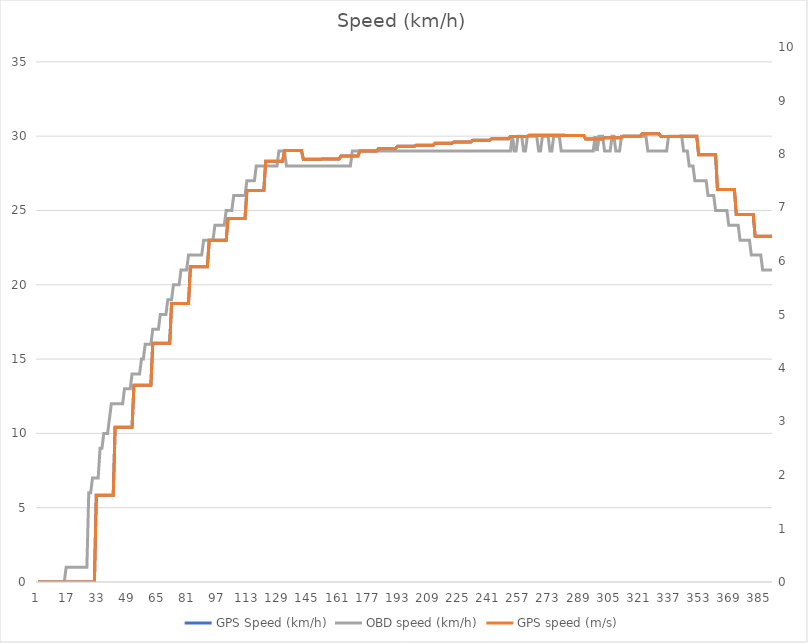
| Category | GPS Speed (km/h) | OBD speed (km/h) |
|---|---|---|
| 0 | 0 | 0 |
| 1 | 0 | 0 |
| 2 | 0 | 0 |
| 3 | 0 | 0 |
| 4 | 0 | 0 |
| 5 | 0 | 0 |
| 6 | 0 | 0 |
| 7 | 0 | 0 |
| 8 | 0 | 0 |
| 9 | 0 | 0 |
| 10 | 0 | 0 |
| 11 | 0 | 0 |
| 12 | 0 | 0 |
| 13 | 0 | 0 |
| 14 | 0 | 0 |
| 15 | 0 | 1 |
| 16 | 0 | 1 |
| 17 | 0 | 1 |
| 18 | 0 | 1 |
| 19 | 0 | 1 |
| 20 | 0 | 1 |
| 21 | 0 | 1 |
| 22 | 0 | 1 |
| 23 | 0 | 1 |
| 24 | 0 | 1 |
| 25 | 0 | 1 |
| 26 | 0 | 1 |
| 27 | 0 | 6 |
| 28 | 0 | 6 |
| 29 | 0 | 7 |
| 30 | 0 | 7 |
| 31 | 5.837 | 7 |
| 32 | 5.837 | 7 |
| 33 | 5.837 | 9 |
| 34 | 5.837 | 9 |
| 35 | 5.837 | 10 |
| 36 | 5.837 | 10 |
| 37 | 5.837 | 10 |
| 38 | 5.837 | 11 |
| 39 | 5.837 | 12 |
| 40 | 5.837 | 12 |
| 41 | 10.408 | 12 |
| 42 | 10.408 | 12 |
| 43 | 10.408 | 12 |
| 44 | 10.408 | 12 |
| 45 | 10.408 | 12 |
| 46 | 10.408 | 13 |
| 47 | 10.408 | 13 |
| 48 | 10.408 | 13 |
| 49 | 10.408 | 13 |
| 50 | 10.408 | 14 |
| 51 | 13.245 | 14 |
| 52 | 13.245 | 14 |
| 53 | 13.245 | 14 |
| 54 | 13.245 | 14 |
| 55 | 13.245 | 15 |
| 56 | 13.245 | 15 |
| 57 | 13.245 | 16 |
| 58 | 13.245 | 16 |
| 59 | 13.245 | 16 |
| 60 | 13.245 | 16 |
| 61 | 16.068 | 17 |
| 62 | 16.068 | 17 |
| 63 | 16.068 | 17 |
| 64 | 16.068 | 17 |
| 65 | 16.068 | 18 |
| 66 | 16.068 | 18 |
| 67 | 16.068 | 18 |
| 68 | 16.068 | 18 |
| 69 | 16.068 | 19 |
| 70 | 16.068 | 19 |
| 71 | 18.743 | 19 |
| 72 | 18.743 | 20 |
| 73 | 18.743 | 20 |
| 74 | 18.743 | 20 |
| 75 | 18.743 | 20 |
| 76 | 18.743 | 21 |
| 77 | 18.743 | 21 |
| 78 | 18.743 | 21 |
| 79 | 18.743 | 21 |
| 80 | 18.743 | 22 |
| 81 | 21.209 | 22 |
| 82 | 21.209 | 22 |
| 83 | 21.209 | 22 |
| 84 | 21.209 | 22 |
| 85 | 21.209 | 22 |
| 86 | 21.209 | 22 |
| 87 | 21.209 | 22 |
| 88 | 21.209 | 23 |
| 89 | 21.209 | 23 |
| 90 | 21.209 | 23 |
| 91 | 22.992 | 23 |
| 92 | 22.992 | 23 |
| 93 | 22.992 | 23 |
| 94 | 22.992 | 24 |
| 95 | 22.992 | 24 |
| 96 | 22.992 | 24 |
| 97 | 22.992 | 24 |
| 98 | 22.992 | 24 |
| 99 | 22.992 | 24 |
| 100 | 22.992 | 25 |
| 101 | 24.455 | 25 |
| 102 | 24.455 | 25 |
| 103 | 24.455 | 25 |
| 104 | 24.455 | 26 |
| 105 | 24.455 | 26 |
| 106 | 24.455 | 26 |
| 107 | 24.455 | 26 |
| 108 | 24.455 | 26 |
| 109 | 24.455 | 26 |
| 110 | 24.455 | 26 |
| 111 | 26.337 | 27 |
| 112 | 26.337 | 27 |
| 113 | 26.337 | 27 |
| 114 | 26.337 | 27 |
| 115 | 26.337 | 27 |
| 116 | 26.337 | 28 |
| 117 | 26.337 | 28 |
| 118 | 26.337 | 28 |
| 119 | 26.337 | 28 |
| 120 | 26.337 | 28 |
| 121 | 28.318 | 28 |
| 122 | 28.318 | 28 |
| 123 | 28.318 | 28 |
| 124 | 28.318 | 28 |
| 125 | 28.318 | 28 |
| 126 | 28.318 | 28 |
| 127 | 28.318 | 28 |
| 128 | 28.318 | 29 |
| 129 | 28.318 | 29 |
| 130 | 28.318 | 29 |
| 131 | 29.031 | 29 |
| 132 | 29.031 | 28 |
| 133 | 29.031 | 28 |
| 134 | 29.031 | 28 |
| 135 | 29.031 | 28 |
| 136 | 29.031 | 28 |
| 137 | 29.031 | 28 |
| 138 | 29.031 | 28 |
| 139 | 29.031 | 28 |
| 140 | 29.031 | 28 |
| 141 | 28.446 | 28 |
| 142 | 28.446 | 28 |
| 143 | 28.446 | 28 |
| 144 | 28.446 | 28 |
| 145 | 28.446 | 28 |
| 146 | 28.446 | 28 |
| 147 | 28.446 | 28 |
| 148 | 28.446 | 28 |
| 149 | 28.446 | 28 |
| 150 | 28.446 | 28 |
| 151 | 28.46 | 28 |
| 152 | 28.46 | 28 |
| 153 | 28.46 | 28 |
| 154 | 28.46 | 28 |
| 155 | 28.46 | 28 |
| 156 | 28.46 | 28 |
| 157 | 28.46 | 28 |
| 158 | 28.46 | 28 |
| 159 | 28.46 | 28 |
| 160 | 28.46 | 28 |
| 161 | 28.662 | 28 |
| 162 | 28.662 | 28 |
| 163 | 28.662 | 28 |
| 164 | 28.662 | 28 |
| 165 | 28.662 | 28 |
| 166 | 28.662 | 28 |
| 167 | 28.662 | 29 |
| 168 | 28.662 | 29 |
| 169 | 28.662 | 29 |
| 170 | 28.662 | 29 |
| 171 | 28.996 | 29 |
| 172 | 28.996 | 29 |
| 173 | 28.996 | 29 |
| 174 | 28.996 | 29 |
| 175 | 28.996 | 29 |
| 176 | 28.996 | 29 |
| 177 | 28.996 | 29 |
| 178 | 28.996 | 29 |
| 179 | 28.996 | 29 |
| 180 | 28.996 | 29 |
| 181 | 29.177 | 29 |
| 182 | 29.177 | 29 |
| 183 | 29.177 | 29 |
| 184 | 29.177 | 29 |
| 185 | 29.177 | 29 |
| 186 | 29.177 | 29 |
| 187 | 29.177 | 29 |
| 188 | 29.177 | 29 |
| 189 | 29.177 | 29 |
| 190 | 29.177 | 29 |
| 191 | 29.318 | 29 |
| 192 | 29.318 | 29 |
| 193 | 29.318 | 29 |
| 194 | 29.318 | 29 |
| 195 | 29.318 | 29 |
| 196 | 29.318 | 29 |
| 197 | 29.318 | 29 |
| 198 | 29.318 | 29 |
| 199 | 29.318 | 29 |
| 200 | 29.318 | 29 |
| 201 | 29.392 | 29 |
| 202 | 29.392 | 29 |
| 203 | 29.392 | 29 |
| 204 | 29.392 | 29 |
| 205 | 29.392 | 29 |
| 206 | 29.392 | 29 |
| 207 | 29.392 | 29 |
| 208 | 29.392 | 29 |
| 209 | 29.392 | 29 |
| 210 | 29.392 | 29 |
| 211 | 29.53 | 29 |
| 212 | 29.53 | 29 |
| 213 | 29.53 | 29 |
| 214 | 29.53 | 29 |
| 215 | 29.53 | 29 |
| 216 | 29.53 | 29 |
| 217 | 29.53 | 29 |
| 218 | 29.53 | 29 |
| 219 | 29.53 | 29 |
| 220 | 29.53 | 29 |
| 221 | 29.607 | 29 |
| 222 | 29.607 | 29 |
| 223 | 29.607 | 29 |
| 224 | 29.607 | 29 |
| 225 | 29.607 | 29 |
| 226 | 29.607 | 29 |
| 227 | 29.607 | 29 |
| 228 | 29.607 | 29 |
| 229 | 29.607 | 29 |
| 230 | 29.607 | 29 |
| 231 | 29.732 | 29 |
| 232 | 29.732 | 29 |
| 233 | 29.732 | 29 |
| 234 | 29.732 | 29 |
| 235 | 29.732 | 29 |
| 236 | 29.732 | 29 |
| 237 | 29.732 | 29 |
| 238 | 29.732 | 29 |
| 239 | 29.732 | 29 |
| 240 | 29.732 | 29 |
| 241 | 29.823 | 29 |
| 242 | 29.823 | 29 |
| 243 | 29.823 | 29 |
| 244 | 29.823 | 29 |
| 245 | 29.823 | 29 |
| 246 | 29.823 | 29 |
| 247 | 29.823 | 29 |
| 248 | 29.823 | 29 |
| 249 | 29.823 | 29 |
| 250 | 29.823 | 29 |
| 251 | 29.971 | 29 |
| 252 | 29.971 | 30 |
| 253 | 29.971 | 29 |
| 254 | 29.971 | 29 |
| 255 | 29.971 | 30 |
| 256 | 29.971 | 30 |
| 257 | 29.971 | 30 |
| 258 | 29.971 | 29 |
| 259 | 29.971 | 29 |
| 260 | 29.971 | 30 |
| 261 | 30.065 | 30 |
| 262 | 30.065 | 30 |
| 263 | 30.065 | 30 |
| 264 | 30.065 | 30 |
| 265 | 30.065 | 30 |
| 266 | 30.065 | 29 |
| 267 | 30.065 | 29 |
| 268 | 30.065 | 30 |
| 269 | 30.065 | 30 |
| 270 | 30.065 | 30 |
| 271 | 30.055 | 30 |
| 272 | 30.055 | 29 |
| 273 | 30.055 | 29 |
| 274 | 30.055 | 30 |
| 275 | 30.055 | 30 |
| 276 | 30.055 | 30 |
| 277 | 30.055 | 30 |
| 278 | 30.055 | 29 |
| 279 | 30.055 | 29 |
| 280 | 30.055 | 29 |
| 281 | 30.039 | 29 |
| 282 | 30.039 | 29 |
| 283 | 30.039 | 29 |
| 284 | 30.039 | 29 |
| 285 | 30.039 | 29 |
| 286 | 30.039 | 29 |
| 287 | 30.039 | 29 |
| 288 | 30.039 | 29 |
| 289 | 30.039 | 29 |
| 290 | 30.039 | 29 |
| 291 | 29.804 | 29 |
| 292 | 29.804 | 29 |
| 293 | 29.804 | 29 |
| 294 | 29.804 | 29 |
| 295 | 29.804 | 29 |
| 296 | 29.804 | 30 |
| 297 | 29.804 | 29 |
| 298 | 29.804 | 30 |
| 299 | 29.804 | 30 |
| 300 | 29.804 | 30 |
| 301 | 29.901 | 29 |
| 302 | 29.901 | 29 |
| 303 | 29.901 | 29 |
| 304 | 29.901 | 29 |
| 305 | 29.901 | 30 |
| 306 | 29.901 | 30 |
| 307 | 29.901 | 29 |
| 308 | 29.901 | 29 |
| 309 | 29.901 | 29 |
| 310 | 29.901 | 30 |
| 311 | 29.999 | 30 |
| 312 | 29.999 | 30 |
| 313 | 29.999 | 30 |
| 314 | 29.999 | 30 |
| 315 | 29.999 | 30 |
| 316 | 29.999 | 30 |
| 317 | 29.999 | 30 |
| 318 | 29.999 | 30 |
| 319 | 29.999 | 30 |
| 320 | 29.999 | 30 |
| 321 | 30.156 | 30 |
| 322 | 30.156 | 30 |
| 323 | 30.156 | 30 |
| 324 | 30.156 | 29 |
| 325 | 30.156 | 29 |
| 326 | 30.156 | 29 |
| 327 | 30.156 | 29 |
| 328 | 30.156 | 29 |
| 329 | 30.156 | 29 |
| 330 | 30.156 | 29 |
| 331 | 29.98 | 29 |
| 332 | 29.98 | 29 |
| 333 | 29.98 | 29 |
| 334 | 29.98 | 29 |
| 335 | 29.98 | 30 |
| 336 | 29.98 | 30 |
| 337 | 29.98 | 30 |
| 338 | 29.98 | 30 |
| 339 | 29.98 | 30 |
| 340 | 29.98 | 30 |
| 341 | 29.987 | 30 |
| 342 | 29.987 | 30 |
| 343 | 29.987 | 29 |
| 344 | 29.987 | 29 |
| 345 | 29.987 | 29 |
| 346 | 29.987 | 28 |
| 347 | 29.987 | 28 |
| 348 | 29.987 | 28 |
| 349 | 29.987 | 27 |
| 350 | 29.987 | 27 |
| 351 | 28.744 | 27 |
| 352 | 28.744 | 27 |
| 353 | 28.744 | 27 |
| 354 | 28.744 | 27 |
| 355 | 28.744 | 27 |
| 356 | 28.744 | 26 |
| 357 | 28.744 | 26 |
| 358 | 28.744 | 26 |
| 359 | 28.744 | 26 |
| 360 | 28.744 | 25 |
| 361 | 26.413 | 25 |
| 362 | 26.413 | 25 |
| 363 | 26.413 | 25 |
| 364 | 26.413 | 25 |
| 365 | 26.413 | 25 |
| 366 | 26.413 | 25 |
| 367 | 26.413 | 24 |
| 368 | 26.413 | 24 |
| 369 | 26.413 | 24 |
| 370 | 26.413 | 24 |
| 371 | 24.727 | 24 |
| 372 | 24.727 | 24 |
| 373 | 24.727 | 23 |
| 374 | 24.727 | 23 |
| 375 | 24.727 | 23 |
| 376 | 24.727 | 23 |
| 377 | 24.727 | 23 |
| 378 | 24.727 | 23 |
| 379 | 24.727 | 22 |
| 380 | 24.727 | 22 |
| 381 | 23.27 | 22 |
| 382 | 23.27 | 22 |
| 383 | 23.27 | 22 |
| 384 | 23.27 | 22 |
| 385 | 23.27 | 21 |
| 386 | 23.27 | 21 |
| 387 | 23.27 | 21 |
| 388 | 23.27 | 21 |
| 389 | 23.27 | 21 |
| 390 | 23.27 | 21 |